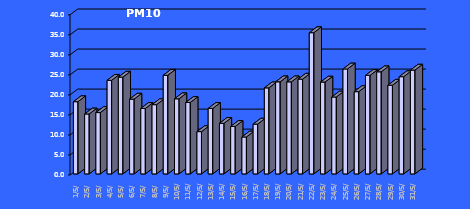
| Category | PM10 [µg/m3] |
|---|---|
| 2023-05-01 | 18.033 |
| 2023-05-02 | 14.965 |
| 2023-05-03 | 15.318 |
| 2023-05-04 | 23.376 |
| 2023-05-05 | 24.156 |
| 2023-05-06 | 18.674 |
| 2023-05-07 | 16.343 |
| 2023-05-08 | 17.29 |
| 2023-05-09 | 24.637 |
| 2023-05-10 | 18.756 |
| 2023-05-11 | 17.834 |
| 2023-05-12 | 10.559 |
| 2023-05-13 | 16.352 |
| 2023-05-14 | 12.625 |
| 2023-05-15 | 11.852 |
| 2023-05-16 | 9.216 |
| 2023-05-17 | 12.437 |
| 2023-05-18 | 21.486 |
| 2023-05-19 | 22.995 |
| 2023-05-20 | 22.986 |
| 2023-05-21 | 23.667 |
| 2023-05-22 | 35.262 |
| 2023-05-23 | 22.928 |
| 2023-05-24 | 19.2 |
| 2023-05-25 | 26.206 |
| 2023-05-26 | 20.542 |
| 2023-05-27 | 24.601 |
| 2023-05-28 | 25.494 |
| 2023-05-29 | 22.152 |
| 2023-05-30 | 24.274 |
| 2023-05-31 | 25.916 |